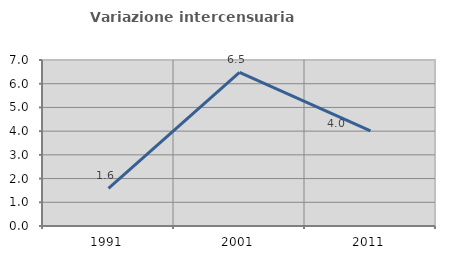
| Category | Variazione intercensuaria annua |
|---|---|
| 1991.0 | 1.589 |
| 2001.0 | 6.474 |
| 2011.0 | 4.016 |